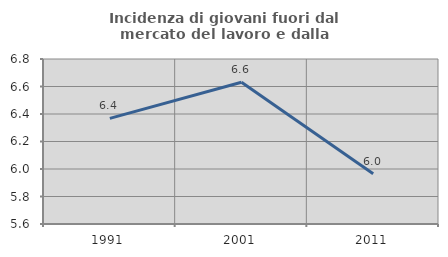
| Category | Incidenza di giovani fuori dal mercato del lavoro e dalla formazione  |
|---|---|
| 1991.0 | 6.368 |
| 2001.0 | 6.631 |
| 2011.0 | 5.965 |